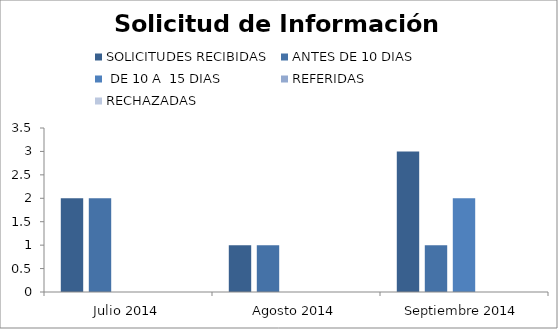
| Category | SOLICITUDES RECIBIDAS | ANTES DE 10 DIAS |  DE 10 A  15 DIAS  | REFERIDAS | RECHAZADAS |
|---|---|---|---|---|---|
| Julio 2014 | 2 | 2 | 0 | 0 | 0 |
| Agosto 2014 | 1 | 1 | 0 | 0 | 0 |
| Septiembre 2014 | 3 | 1 | 2 | 0 | 0 |